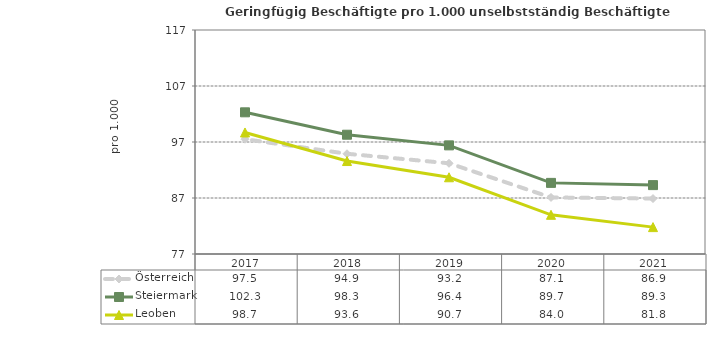
| Category | Österreich | Steiermark | Leoben |
|---|---|---|---|
| 2021.0 | 86.9 | 89.3 | 81.8 |
| 2020.0 | 87.1 | 89.7 | 84 |
| 2019.0 | 93.2 | 96.4 | 90.7 |
| 2018.0 | 94.9 | 98.3 | 93.6 |
| 2017.0 | 97.5 | 102.3 | 98.7 |